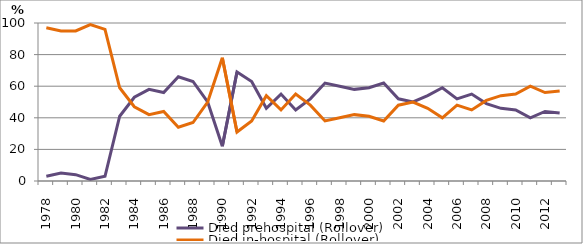
| Category | Died prehospital (Rollover) | Died in-hospital (Rollover) |
|---|---|---|
| 1978.0 | 3 | 97 |
| 1979.0 | 5 | 95 |
| 1980.0 | 4 | 95 |
| 1981.0 | 1 | 99 |
| 1982.0 | 3 | 96 |
| 1983.0 | 41 | 59 |
| 1984.0 | 53 | 47 |
| 1985.0 | 58 | 42 |
| 1986.0 | 56 | 44 |
| 1987.0 | 66 | 34 |
| 1988.0 | 63 | 37 |
| 1989.0 | 50 | 50 |
| 1990.0 | 22 | 78 |
| 1991.0 | 69 | 31 |
| 1992.0 | 63 | 38 |
| 1993.0 | 46 | 54 |
| 1994.0 | 55 | 45 |
| 1995.0 | 45 | 55 |
| 1996.0 | 52 | 48 |
| 1997.0 | 62 | 38 |
| 1998.0 | 60 | 40 |
| 1999.0 | 58 | 42 |
| 2000.0 | 59 | 41 |
| 2001.0 | 62 | 38 |
| 2002.0 | 52 | 48 |
| 2003.0 | 50 | 50 |
| 2004.0 | 54 | 46 |
| 2005.0 | 59 | 40 |
| 2006.0 | 52 | 48 |
| 2007.0 | 55 | 45 |
| 2008.0 | 49 | 51 |
| 2009.0 | 46 | 54 |
| 2010.0 | 45 | 55 |
| 2011.0 | 40 | 60 |
| 2012.0 | 44 | 56 |
| 2013.0 | 43 | 57 |